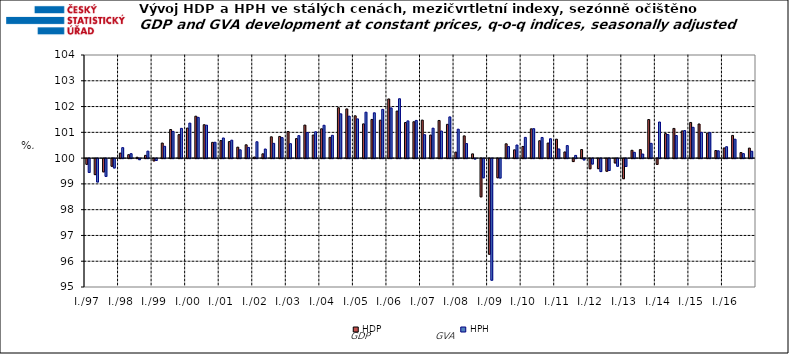
| Category | HDP

 | HPH

 |
|---|---|---|
| I./97 | 99.777 | 99.464 |
|  | 99.379 | 99.092 |
|  | 99.485 | 99.31 |
|  | 99.703 | 99.636 |
| I./98 | 100.194 | 100.406 |
|  | 100.133 | 100.173 |
|  | 100.033 | 99.958 |
|  | 100.107 | 100.271 |
| I./99 | 99.911 | 99.927 |
|  | 100.584 | 100.459 |
|  | 101.11 | 101.036 |
|  | 100.911 | 101.155 |
| I./00 | 101.165 | 101.358 |
|  | 101.626 | 101.58 |
|  | 101.295 | 101.277 |
|  | 100.611 | 100.614 |
| I./01 | 100.68 | 100.781 |
|  | 100.641 | 100.696 |
|  | 100.425 | 100.322 |
|  | 100.516 | 100.415 |
| I./02 | 100.042 | 100.634 |
|  | 100.166 | 100.353 |
|  | 100.826 | 100.573 |
|  | 100.841 | 100.795 |
| I./03 | 101.033 | 100.56 |
|  | 100.757 | 100.872 |
|  | 101.281 | 100.995 |
|  | 100.896 | 101.022 |
| I./04 | 101.137 | 101.274 |
|  | 100.805 | 100.886 |
|  | 101.955 | 101.717 |
|  | 101.909 | 101.627 |
| I./05 | 101.641 | 101.521 |
|  | 101.328 | 101.781 |
|  | 101.5 | 101.758 |
|  | 101.471 | 101.89 |
| I./06 | 102.296 | 101.947 |
|  | 101.825 | 102.303 |
|  | 101.38 | 101.444 |
|  | 101.411 | 101.463 |
| I./07 | 101.475 | 100.909 |
|  | 100.895 | 101.161 |
|  | 101.461 | 101.051 |
|  | 101.31 | 101.599 |
| I./08 | 100.233 | 101.122 |
|  | 100.863 | 100.563 |
|  | 100.164 | 99.983 |
|  | 98.517 | 99.255 |
| I./09 | 96.289 | 95.282 |
|  | 99.257 | 99.246 |
|  | 100.555 | 100.447 |
|  | 100.321 | 100.508 |
| I./10 | 100.452 | 100.804 |
|  | 101.136 | 101.142 |
|  | 100.675 | 100.801 |
|  | 100.584 | 100.752 |
| I./11 | 100.736 | 100.356 |
|  | 100.239 | 100.487 |
|  | 99.885 | 100.106 |
|  | 100.333 | 99.948 |
| I./12 | 99.607 | 99.789 |
|  | 99.61 | 99.497 |
|  | 99.51 | 99.539 |
|  | 99.83 | 99.703 |
| I./13 | 99.22 | 99.696 |
|  | 100.304 | 100.225 |
|  | 100.331 | 100.159 |
|  | 101.496 | 100.573 |
| I./14 | 99.776 | 101.401 |
|  | 100.952 | 100.914 |
|  | 101.152 | 100.877 |
|  | 101.055 | 101.069 |
| I./15 | 101.383 | 101.195 |
|  | 101.324 | 100.999 |
|  | 100.969 | 100.99 |
|  | 100.295 | 100.283 |
| I./16 | 100.394 | 100.442 |